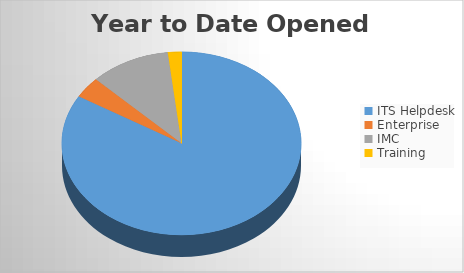
| Category | YTD Opened Tickets | 6M Opened |
|---|---|---|
| ITS Helpdesk | 1544 | 1544 |
| Enterprise | 69 | 69 |
| IMC | 200 | 200 |
| Training | 34 | 34 |